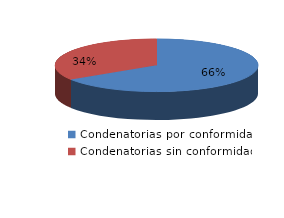
| Category | Series 0 |
|---|---|
| 0 | 275 |
| 1 | 142 |